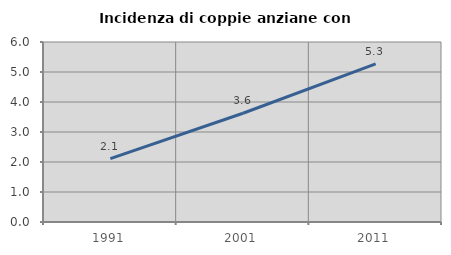
| Category | Incidenza di coppie anziane con figli |
|---|---|
| 1991.0 | 2.112 |
| 2001.0 | 3.625 |
| 2011.0 | 5.271 |